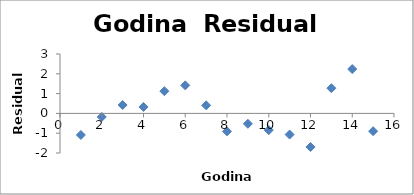
| Category | Series 0 |
|---|---|
| 1.0 | -1.088 |
| 2.0 | -0.18 |
| 3.0 | 0.424 |
| 4.0 | 0.325 |
| 5.0 | 1.122 |
| 6.0 | 1.416 |
| 7.0 | 0.406 |
| 8.0 | -0.907 |
| 9.0 | -0.524 |
| 10.0 | -0.844 |
| 11.0 | -1.068 |
| 12.0 | -1.695 |
| 13.0 | 1.274 |
| 14.0 | 2.24 |
| 15.0 | -0.898 |